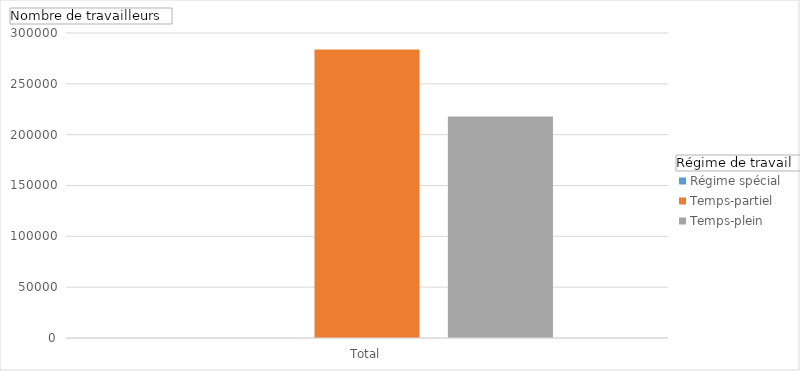
| Category | Régime spécial | Temps-partiel | Temps-plein |
|---|---|---|---|
| Total | 46 | 283881 | 217774 |